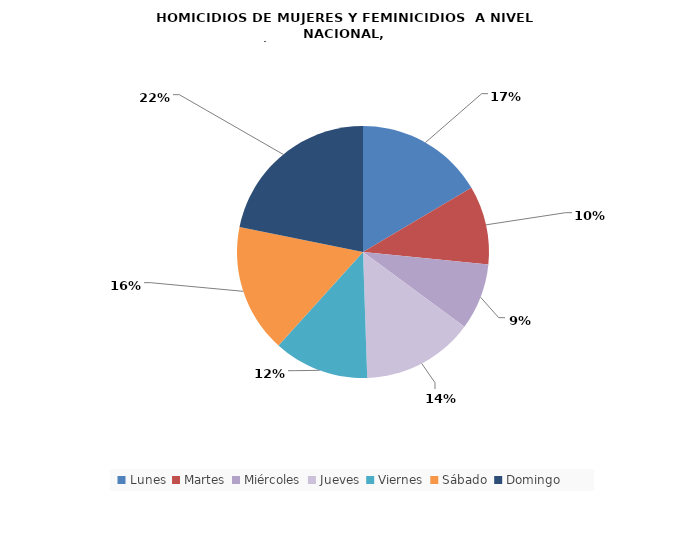
| Category | Lunes |
|---|---|
| Lunes | 31 |
| Martes | 19 |
| Miércoles | 16 |
| Jueves | 27 |
| Viernes | 23 |
| Sábado | 31 |
| Domingo | 41 |